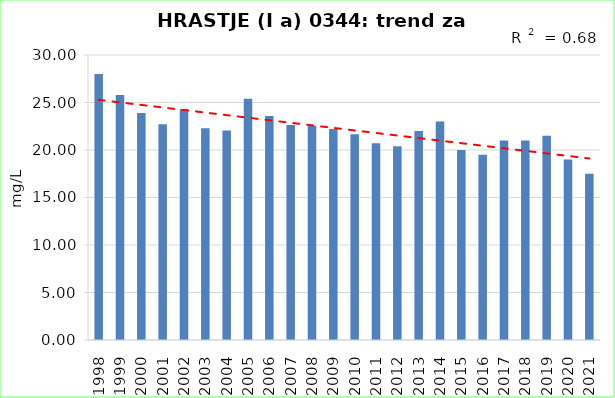
| Category | Vsota |
|---|---|
| 1998 | 28 |
| 1999 | 25.8 |
| 2000 | 23.9 |
| 2001 | 22.7 |
| 2002 | 24.3 |
| 2003 | 22.3 |
| 2004 | 22.05 |
| 2005 | 25.4 |
| 2006 | 23.575 |
| 2007 | 22.625 |
| 2008 | 22.55 |
| 2009 | 22.2 |
| 2010 | 21.65 |
| 2011 | 20.7 |
| 2012 | 20.4 |
| 2013 | 22 |
| 2014 | 23 |
| 2015 | 20 |
| 2016 | 19.5 |
| 2017 | 21 |
| 2018 | 21 |
| 2019 | 21.5 |
| 2020 | 19 |
| 2021 | 17.5 |